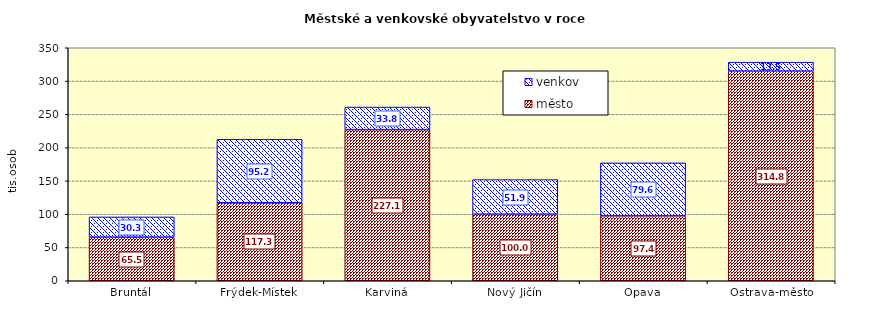
| Category | město | venkov |
|---|---|---|
| Bruntál | 65545 | 30328 |
| Frýdek-Místek | 117294 | 95154 |
| Karviná | 227077 | 33842 |
| Nový Jičín | 100025 | 51935 |
| Opava | 97447 | 79632 |
| Ostrava-město | 314845 | 13478 |